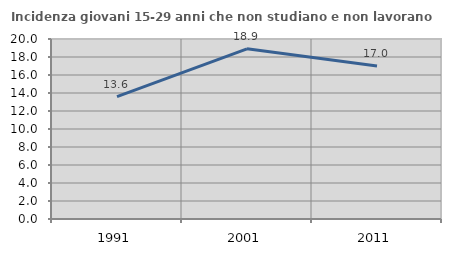
| Category | Incidenza giovani 15-29 anni che non studiano e non lavorano  |
|---|---|
| 1991.0 | 13.597 |
| 2001.0 | 18.908 |
| 2011.0 | 17.012 |